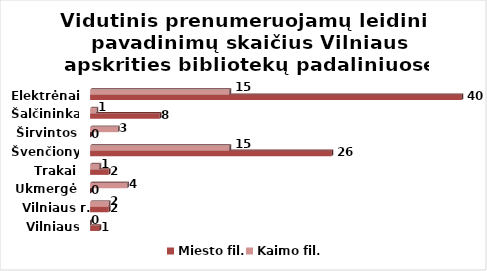
| Category | Miesto fil. | Kaimo fil. |
|---|---|---|
| Vilniaus m. | 1 | 0 |
| Vilniaus r. | 2 | 2 |
| Ukmergė | 0 | 4 |
| Trakai | 2 | 1 |
| Švenčionys | 26 | 15 |
| Širvintos | 0 | 3 |
| Šalčininkai | 7.5 | 0.68 |
| Elektrėnai | 40 | 15 |